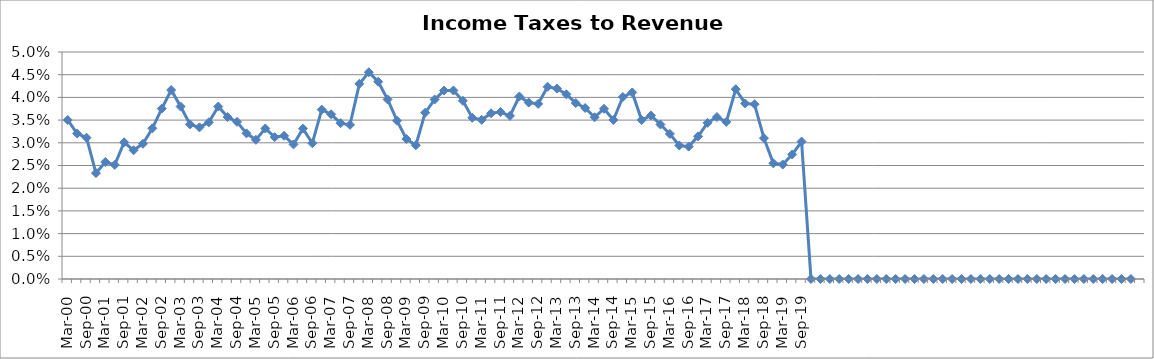
| Category | Income Taxes to Revenue (%) |
|---|---|
| Mar-00 | 0.035 |
| Jun-00 | 0.032 |
| Sep-00 | 0.031 |
| Dec-00 | 0.023 |
| Mar-01 | 0.026 |
| Jun-01 | 0.025 |
| Sep-01 | 0.03 |
| Dec-01 | 0.028 |
| Mar-02 | 0.03 |
| Jun-02 | 0.033 |
| Sep-02 | 0.038 |
| Dec-02 | 0.042 |
| Mar-03 | 0.038 |
| Jun-03 | 0.034 |
| Sep-03 | 0.033 |
| Dec-03 | 0.035 |
| Mar-04 | 0.038 |
| Jun-04 | 0.036 |
| Sep-04 | 0.035 |
| Dec-04 | 0.032 |
| Mar-05 | 0.031 |
| Jun-05 | 0.033 |
| Sep-05 | 0.031 |
| Dec-05 | 0.032 |
| Mar-06 | 0.03 |
| Jun-06 | 0.033 |
| Sep-06 | 0.03 |
| Dec-06 | 0.037 |
| Mar-07 | 0.036 |
| Jun-07 | 0.034 |
| Sep-07 | 0.034 |
| Dec-07 | 0.043 |
| Mar-08 | 0.046 |
| Jun-08 | 0.043 |
| Sep-08 | 0.04 |
| Dec-08 | 0.035 |
| Mar-09 | 0.031 |
| Jun-09 | 0.029 |
| Sep-09 | 0.037 |
| Dec-09 | 0.04 |
| Mar-10 | 0.042 |
| Jun-10 | 0.042 |
| Sep-10 | 0.039 |
| Dec-10 | 0.036 |
| Mar-11 | 0.035 |
| Jun-11 | 0.036 |
| Sep-11 | 0.037 |
| Dec-11 | 0.036 |
| Mar-12 | 0.04 |
| Jun-12 | 0.039 |
| Sep-12 | 0.039 |
| Dec-12 | 0.042 |
| Mar-13 | 0.042 |
| Jun-13 | 0.041 |
| Sep-13 | 0.039 |
| Dec-13 | 0.038 |
| Mar-14 | 0.036 |
| Jun-14 | 0.037 |
| Sep-14 | 0.035 |
| Dec-14 | 0.04 |
| Mar-15 | 0.041 |
| Jun-15 | 0.035 |
| Sep-15 | 0.036 |
| Dec-15 | 0.034 |
| Mar-16 | 0.032 |
| Jun-16 | 0.029 |
| Sep-16 | 0.029 |
| Dec-16 | 0.031 |
| Mar-17 | 0.034 |
| Jun-17 | 0.036 |
| Sep-17 | 0.035 |
| Dec-17 | 0.042 |
| Mar-18 | 0.039 |
| Jun-18 | 0.038 |
| Sep-18 | 0.031 |
| Dec-18 | 0.025 |
| Mar-19 | 0.025 |
| Jun-19 | 0.027 |
| Sep-19 | 0.03 |